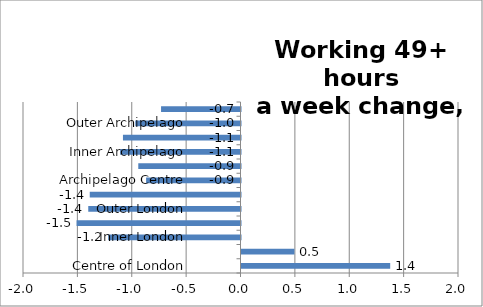
| Category | Series 0 |
|---|---|
| Centre of London | 1.367 |
| London Core | 0.487 |
| Inner London | -1.217 |
| London Suburbs | -1.507 |
| Outer London | -1.4 |
| London Edge | -1.386 |
| Archipelago Centre | -0.868 |
| Archipelago Core | -0.94 |
| Inner Archipelago | -1.107 |
| Archipelago Suburbs | -1.081 |
| Outer Archipelago | -0.967 |
| Archipelago Edge | -0.731 |